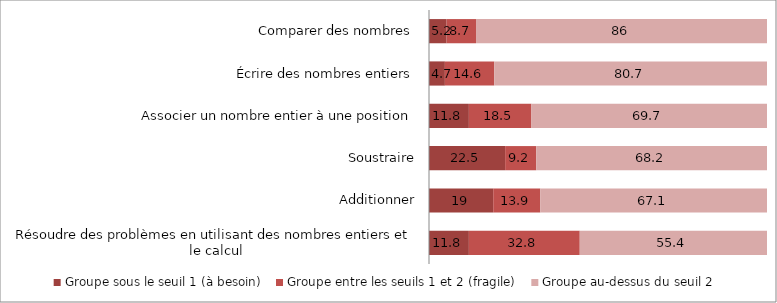
| Category | Groupe sous le seuil 1 (à besoin) | Groupe entre les seuils 1 et 2 (fragile) | Groupe au-dessus du seuil 2 |
|---|---|---|---|
| Résoudre des problèmes en utilisant des nombres entiers et le calcul | 11.8 | 32.8 | 55.4 |
| Additionner | 19 | 13.9 | 67.1 |
| Soustraire | 22.5 | 9.2 | 68.2 |
| Associer un nombre entier à une position | 11.8 | 18.5 | 69.7 |
| Écrire des nombres entiers | 4.7 | 14.6 | 80.7 |
| Comparer des nombres | 5.2 | 8.7 | 86 |